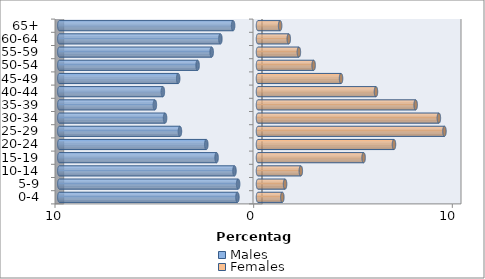
| Category | Males | Females |
|---|---|---|
| 0-4 | -1.036 | 1.225 |
| 5-9 | -1 | 1.362 |
| 10-14 | -1.185 | 2.156 |
| 15-19 | -2.085 | 5.316 |
| 20-24 | -2.602 | 6.845 |
| 25-29 | -3.929 | 9.385 |
| 30-34 | -4.678 | 9.105 |
| 35-39 | -5.191 | 7.936 |
| 40-44 | -4.789 | 5.938 |
| 45-49 | -4.018 | 4.18 |
| 50-54 | -3.04 | 2.8 |
| 55-59 | -2.331 | 2.058 |
| 60-64 | -1.893 | 1.549 |
| 65+ | -1.253 | 1.113 |